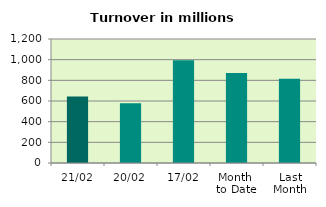
| Category | Series 0 |
|---|---|
| 21/02 | 643.175 |
| 20/02 | 577.532 |
| 17/02 | 993.38 |
| Month 
to Date | 871.669 |
| Last
Month | 814.821 |